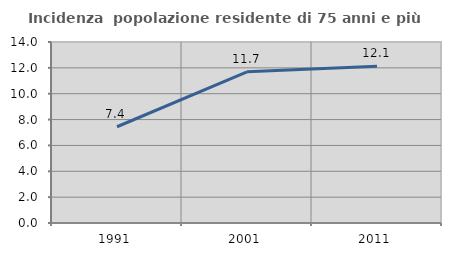
| Category | Incidenza  popolazione residente di 75 anni e più |
|---|---|
| 1991.0 | 7.445 |
| 2001.0 | 11.691 |
| 2011.0 | 12.12 |